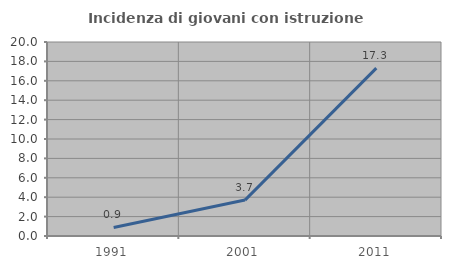
| Category | Incidenza di giovani con istruzione universitaria |
|---|---|
| 1991.0 | 0.885 |
| 2001.0 | 3.704 |
| 2011.0 | 17.308 |